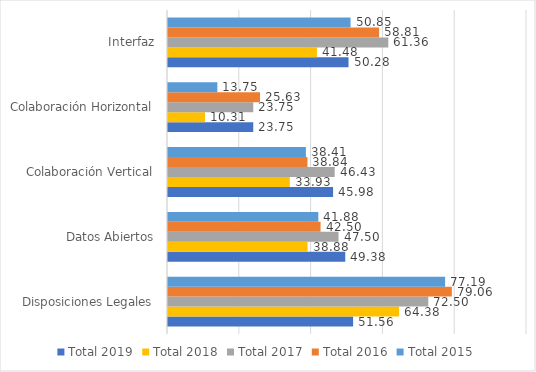
| Category | Total 2019 | Total 2018 | Total 2017 | Total 2016 | Total 2015 |
|---|---|---|---|---|---|
| Disposiciones Legales | 51.562 | 64.375 | 72.5 | 79.062 | 77.188 |
| Datos Abiertos | 49.375 | 38.875 | 47.5 | 42.5 | 41.875 |
| Colaboración Vertical | 45.982 | 33.929 | 46.429 | 38.839 | 38.411 |
| Colaboración Horizontal | 23.75 | 10.312 | 23.75 | 25.625 | 13.75 |
| Interfaz | 50.284 | 41.477 | 61.364 | 58.807 | 50.852 |